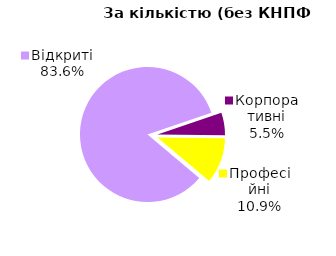
| Category | Series 0 | 30.06.2021 | 31.12.2022** | 31.03.2023** | 30.06.2023 | Зміна за 2-й квартал 2022 року | Зміна з початку року | Зміна за 2 роки |
|---|---|---|---|---|---|---|---|---|
| Відкриті | 46 |  |  | 45 | 46 | 0.022 | 0.022 | 0.022 |
| Корпоративні | 3 |  |  | 3 | 3 | 0 | 0 | 0 |
| Професійні | 6 |  |  | 6 | 6 | 0 | 0 | 0 |